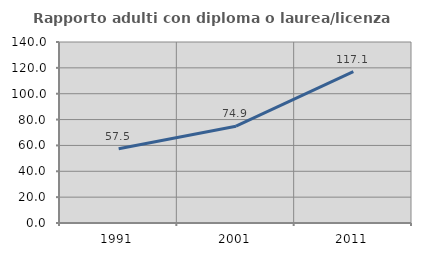
| Category | Rapporto adulti con diploma o laurea/licenza media  |
|---|---|
| 1991.0 | 57.5 |
| 2001.0 | 74.879 |
| 2011.0 | 117.127 |